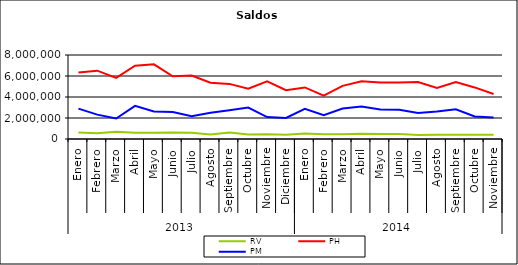
| Category | RV | PH | PM |
|---|---|---|---|
| 0 | 625726.624 | 6338490.057 | 2894951.851 |
| 1 | 552164.14 | 6505711.807 | 2320902.81 |
| 2 | 684317.675 | 5822855.149 | 1948127.804 |
| 3 | 601474.166 | 6976391.987 | 3151453.143 |
| 4 | 590050.657 | 7107878.906 | 2620515.735 |
| 5 | 624993.58 | 5975534.656 | 2574055.31 |
| 6 | 600696.535 | 6050025.472 | 2173848.831 |
| 7 | 419012.816 | 5367684.924 | 2503871.717 |
| 8 | 611730.758 | 5247250.768 | 2727549.288 |
| 9 | 419155.215 | 4784420.625 | 2990459.774 |
| 10 | 447319.577 | 5481772.72 | 2092491.866 |
| 11 | 408611.698 | 4646492.747 | 1999878.157 |
| 12 | 527889.485 | 4912075.273 | 2877652.76 |
| 13 | 454567.098 | 4120538.063 | 2278357.683 |
| 14 | 451499.2 | 5057360.029 | 2895505.472 |
| 15 | 496328.639 | 5498657.25 | 3083378.882 |
| 16 | 484463.452 | 5384146.137 | 2812191.042 |
| 17 | 465266.869 | 5373295.415 | 2775261.669 |
| 18 | 390003.439 | 5435984.925 | 2470327.976 |
| 19 | 403145.138 | 4872387.208 | 2622344.549 |
| 20 | 394930.475 | 5416500.478 | 2826484.554 |
| 21 | 412609.452 | 4912801.025 | 2138213.269 |
| 22 | 402733.198 | 4288987.896 | 2045982.83 |